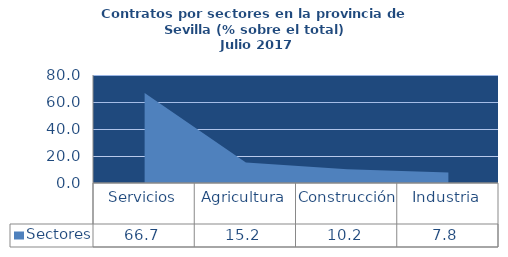
| Category | Sectores |
|---|---|
| Servicios | 66.744 |
| Agricultura | 15.248 |
| Construcción | 10.2 |
| Industria | 7.808 |